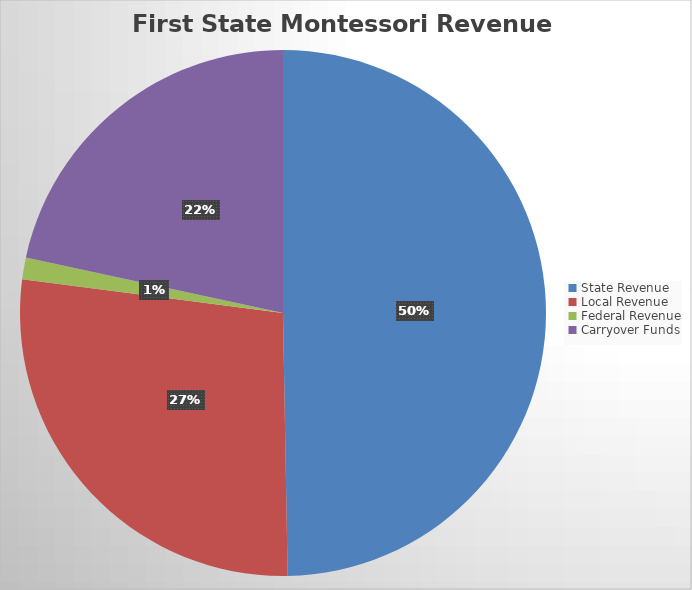
| Category | Series 0 |
|---|---|
| State Revenue | 6221021.24 |
| Local Revenue | 3419241.79 |
| Federal Revenue | 167344 |
| Carryover Funds | 2704941.32 |